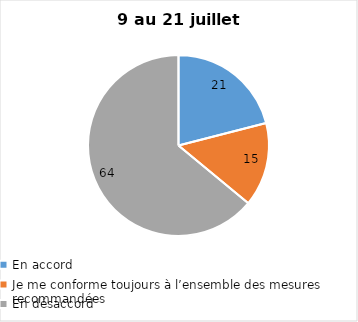
| Category | Series 0 |
|---|---|
| En accord | 21 |
| Je me conforme toujours à l’ensemble des mesures recommandées | 15 |
| En désaccord | 64 |